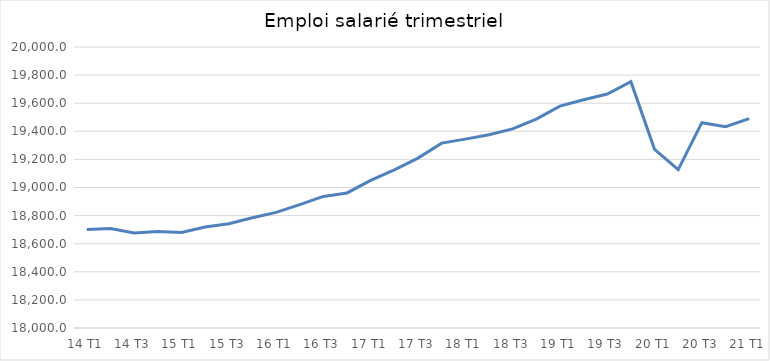
| Category | En milliers de salariés |
|---|---|
| 14 T1 | 18701.6 |
| 14 T2 | 18708.4 |
| 14 T3 | 18676.5 |
| 14 T4 | 18687.3 |
| 15 T1 | 18679.3 |
| 15 T2 | 18718.7 |
| 15 T3 | 18741.8 |
| 15 T4 | 18784.3 |
| 16 T1 | 18822.8 |
| 16 T2 | 18877.9 |
| 16 T3 | 18936.6 |
| 16 T4 | 18961.3 |
| 17 T1 | 19050.9 |
| 17 T2 | 19125.9 |
| 17 T3 | 19209.3 |
| 17 T4 | 19315.8 |
| 18 T1 | 19344.2 |
| 18 T2 | 19375.9 |
| 18 T3 | 19417.3 |
| 18 T4 | 19487 |
| 19 T1 | 19579.1 |
| 19 T2 | 19624.2 |
| 19 T3 | 19665.1 |
| 19 T4 | 19752.8 |
| 20 T1 | 19271.6 |
| 20 T2 | 19127.4 |
|  20 T3  | 19461.4 |
| 20 T4 | 19432.5 |
| 21 T1 | 19489.8 |